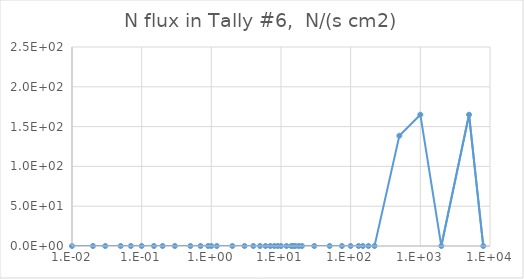
| Category | Series 0 |
|---|---|
| 1e-09 | 0 |
| 1e-08 | 0 |
| 2.5e-08 | 0 |
| 1e-07 | 0 |
| 2e-07 | 0 |
| 5e-07 | 0 |
| 1e-06 | 0 |
| 2e-06 | 0 |
| 5e-06 | 0 |
| 1e-05 | 0 |
| 2e-05 | 0 |
| 5e-05 | 0 |
| 0.0001 | 0 |
| 0.0002 | 0 |
| 0.0005 | 0 |
| 0.001 | 0 |
| 0.002 | 0 |
| 0.005 | 0 |
| 0.01 | 0 |
| 0.02 | 0 |
| 0.03 | 0 |
| 0.05 | 0 |
| 0.07 | 0 |
| 0.1 | 0 |
| 0.15 | 0 |
| 0.2 | 0 |
| 0.3 | 0 |
| 0.5 | 0 |
| 0.7 | 0 |
| 0.9 | 0 |
| 1.0 | 0 |
| 1.2 | 0 |
| 2.0 | 0 |
| 3.0 | 0 |
| 4.0 | 0 |
| 5.0 | 0 |
| 6.0 | 0 |
| 7.0 | 0 |
| 8.0 | 0 |
| 9.0 | 0 |
| 10.0 | 0 |
| 12.0 | 0 |
| 14.0 | 0 |
| 15.0 | 0 |
| 16.0 | 0 |
| 18.0 | 0 |
| 20.0 | 0 |
| 30.0 | 0 |
| 50.0 | 0 |
| 75.0 | 0 |
| 100.0 | 0 |
| 130.0 | 0 |
| 150.0 | 0 |
| 180.0 | 0 |
| 220.0 | 0 |
| 500.0 | 0.495 |
| 1000.0 | 0.33 |
| 2000.0 | 0 |
| 5000.0 | 0.055 |
| 8000.0 | 0 |